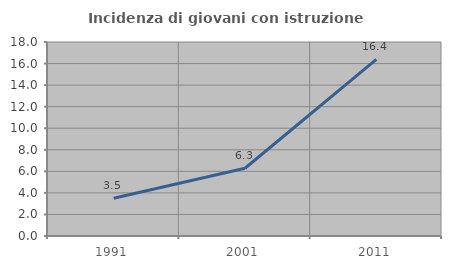
| Category | Incidenza di giovani con istruzione universitaria |
|---|---|
| 1991.0 | 3.5 |
| 2001.0 | 6.286 |
| 2011.0 | 16.379 |